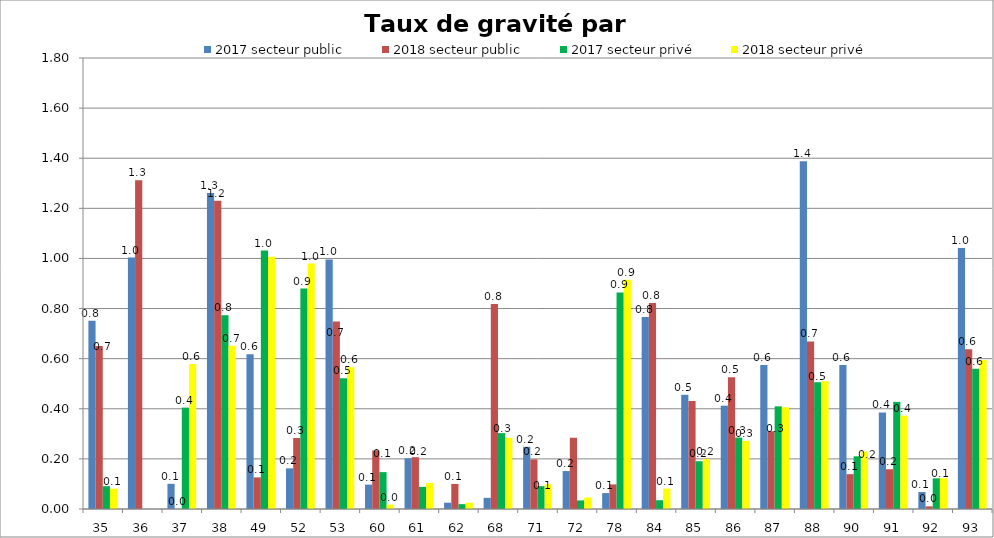
| Category | 2017 secteur public | 2018 secteur public | 2017 secteur privé | 2018 secteur privé |
|---|---|---|---|---|
| 35 | 0.751 | 0.651 | 0.091 | 0.081 |
| 36 | 1.003 | 1.312 | 0 | 0 |
| 37 | 0.1 | 0 | 0.405 | 0.579 |
| 38 | 1.261 | 1.23 | 0.773 | 0.652 |
| 49 | 0.618 | 0.126 | 1.031 | 1.007 |
| 52 | 0.162 | 0.283 | 0.88 | 0.979 |
| 53 | 0.996 | 0.749 | 0.522 | 0.566 |
| 60 | 0.097 | 0.234 | 0.147 | 0.017 |
| 61 | 0.203 | 0.207 | 0.088 | 0.104 |
| 62 | 0.025 | 0.1 | 0.019 | 0.025 |
| 68 | 0.045 | 0.818 | 0.303 | 0.284 |
| 71 | 0.248 | 0.198 | 0.091 | 0.099 |
| 72 | 0.151 | 0.284 | 0.034 | 0.046 |
| 78 | 0.064 | 0.098 | 0.865 | 0.915 |
| 84 | 0.767 | 0.823 | 0.035 | 0.082 |
| 85 | 0.456 | 0.431 | 0.191 | 0.2 |
| 86 | 0.412 | 0.526 | 0.285 | 0.272 |
| 87 | 0.574 | 0.31 | 0.41 | 0.406 |
| 88 | 1.388 | 0.669 | 0.506 | 0.51 |
| 90 | 0.575 | 0.139 | 0.21 | 0.229 |
| 91 | 0.386 | 0.159 | 0.428 | 0.372 |
| 92 | 0.068 | 0.011 | 0.123 | 0.123 |
| 93 | 1.042 | 0.638 | 0.56 | 0.595 |